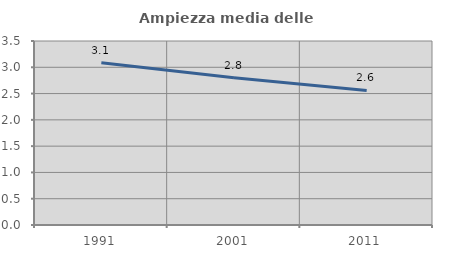
| Category | Ampiezza media delle famiglie |
|---|---|
| 1991.0 | 3.086 |
| 2001.0 | 2.801 |
| 2011.0 | 2.559 |